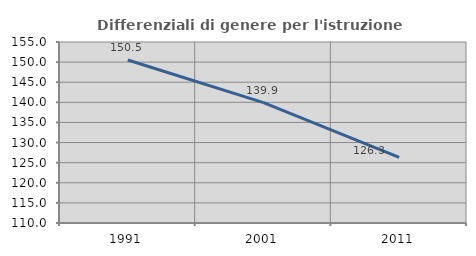
| Category | Differenziali di genere per l'istruzione superiore |
|---|---|
| 1991.0 | 150.517 |
| 2001.0 | 139.94 |
| 2011.0 | 126.316 |